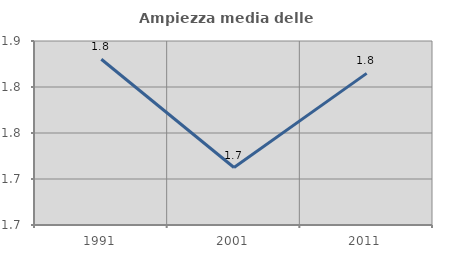
| Category | Ampiezza media delle famiglie |
|---|---|
| 1991.0 | 1.83 |
| 2001.0 | 1.712 |
| 2011.0 | 1.815 |